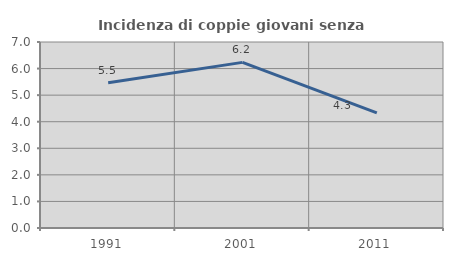
| Category | Incidenza di coppie giovani senza figli |
|---|---|
| 1991.0 | 5.468 |
| 2001.0 | 6.233 |
| 2011.0 | 4.33 |